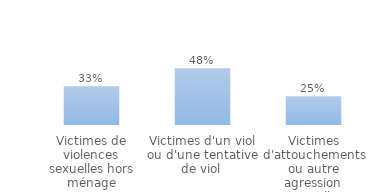
| Category | au moins une démarche |
|---|---|
| Victimes de violences sexuelles hors ménage | 0.332 |
| Victimes d'un viol ou d'une tentative de viol  | 0.485 |
| Victimes d'attouchements ou autre agression sexuelle | 0.245 |